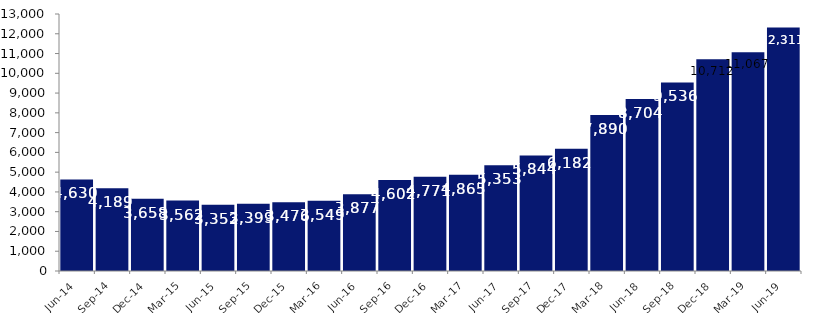
| Category | Series 0 |
|---|---|
| Jun-14 | 4630 |
| Sep-14 | 4189 |
| Dec-14 | 3658 |
| Mar-15 | 3562 |
| Jun-15 | 3352 |
| Sep-15 | 3399 |
| Dec-15 | 3476 |
| Mar-16 | 3549 |
| Jun-16 | 3877 |
| Sep-16 | 4602 |
| Dec-16 | 4771 |
| Mar-17 | 4865 |
| Jun-17 | 5353 |
| Sep-17 | 5844 |
| Dec-17 | 6182 |
| Mar-18 | 7890 |
| Jun-18 | 8704 |
| Sep-18 | 9536 |
| Dec-18 | 10712 |
| Mar-19 | 11067 |
| Jun-19 | 12311 |